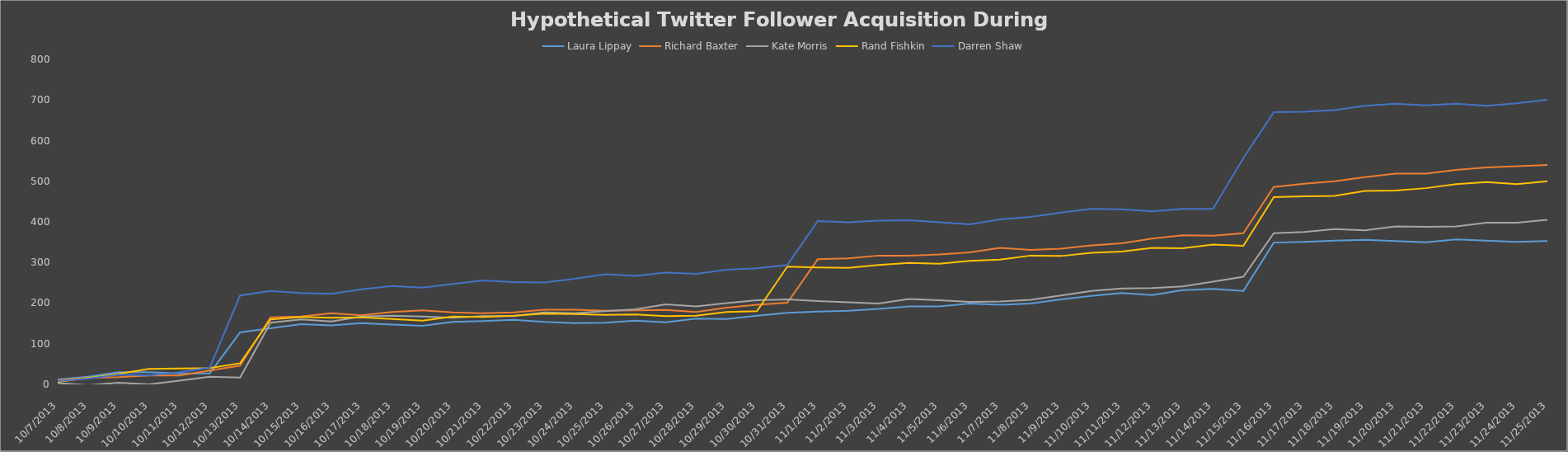
| Category | Laura Lippay | Richard Baxter | Kate Morris | Rand Fishkin | Darren Shaw |
|---|---|---|---|---|---|
| 10/7/13 | 12 | 10 | 3 | 6 | 8 |
| 10/8/13 | 19 | 16 | -2 | 16 | 14 |
| 10/9/13 | 30 | 18 | 4 | 26 | 24 |
| 10/10/13 | 30 | 22 | 0 | 38 | 22 |
| 10/11/13 | 27 | 22 | 9 | 39 | 30 |
| 10/12/13 | 27 | 34 | 19 | 40 | 41 |
| 10/13/13 | 128 | 46 | 17 | 52 | 219 |
| 10/14/13 | 138 | 165 | 152 | 160 | 230 |
| 10/15/13 | 148 | 167 | 160 | 166 | 225 |
| 10/16/13 | 145 | 175 | 155 | 164 | 223 |
| 10/17/13 | 151 | 170 | 167 | 165 | 234 |
| 10/18/13 | 147 | 178 | 169 | 161 | 242 |
| 10/19/13 | 144 | 182 | 167 | 157 | 238 |
| 10/20/13 | 154 | 177 | 164 | 167 | 247 |
| 10/21/13 | 156 | 175 | 168 | 166 | 256 |
| 10/22/13 | 159 | 177 | 168 | 169 | 252 |
| 10/23/13 | 154 | 184 | 177 | 174 | 251 |
| 10/24/13 | 151 | 184 | 175 | 173 | 260 |
| 10/25/13 | 152 | 181 | 180 | 171 | 271 |
| 10/26/13 | 157 | 182 | 185 | 172 | 267 |
| 10/27/13 | 153 | 183 | 197 | 168 | 275 |
| 10/28/13 | 162 | 178 | 192 | 169 | 272 |
| 10/29/13 | 161 | 189 | 200 | 178 | 282 |
| 10/30/13 | 169 | 196 | 207 | 180 | 286 |
| 10/31/13 | 176 | 201 | 209 | 290 | 294 |
| 11/1/13 | 179 | 308 | 205 | 288 | 402 |
| 11/2/13 | 181 | 310 | 202 | 287 | 399 |
| 11/3/13 | 186 | 317 | 199 | 294 | 403 |
| 11/4/13 | 192 | 317 | 210 | 299 | 404 |
| 11/5/13 | 192 | 320 | 207 | 297 | 399 |
| 11/6/13 | 199 | 325 | 203 | 304 | 394 |
| 11/7/13 | 196 | 336 | 204 | 307 | 406 |
| 11/8/13 | 199 | 331 | 208 | 317 | 412 |
| 11/9/13 | 209 | 334 | 219 | 316 | 423 |
| 11/10/13 | 218 | 342 | 230 | 324 | 432 |
| 11/11/13 | 225 | 347 | 236 | 327 | 431 |
| 11/12/13 | 220 | 359 | 237 | 336 | 426 |
| 11/13/13 | 232 | 367 | 241 | 335 | 432 |
| 11/14/13 | 235 | 366 | 253 | 344 | 432 |
| 11/15/13 | 230 | 372 | 265 | 341 | 557 |
| 11/16/13 | 349 | 486 | 372 | 461 | 670 |
| 11/17/13 | 351 | 494 | 375 | 463 | 671 |
| 11/18/13 | 354 | 500 | 382 | 464 | 675 |
| 11/19/13 | 356 | 510 | 379 | 476 | 686 |
| 11/20/13 | 353 | 519 | 389 | 477 | 691 |
| 11/21/13 | 350 | 519 | 388 | 483 | 687 |
| 11/22/13 | 357 | 528 | 389 | 493 | 691 |
| 11/23/13 | 354 | 534 | 398 | 498 | 686 |
| 11/24/13 | 351 | 537 | 398 | 493 | 692 |
| 11/25/13 | 353 | 540 | 405 | 500 | 701 |